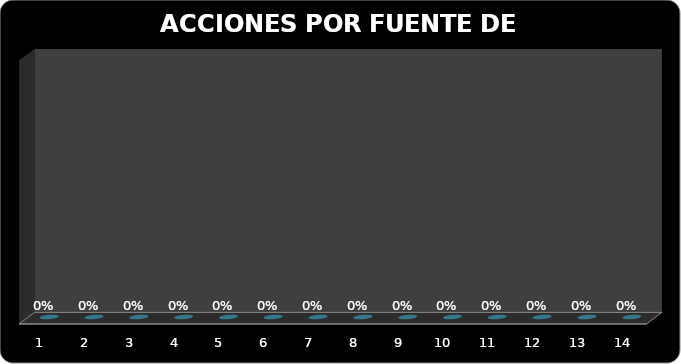
| Category | ACCIONES TIPO DE FUENTE |
|---|---|
| 0 | 0 |
| 1 | 0 |
| 2 | 0 |
| 3 | 0 |
| 4 | 0 |
| 5 | 0 |
| 6 | 0 |
| 7 | 0 |
| 8 | 0 |
| 9 | 0 |
| 10 | 0 |
| 11 | 0 |
| 12 | 0 |
| 13 | 0 |